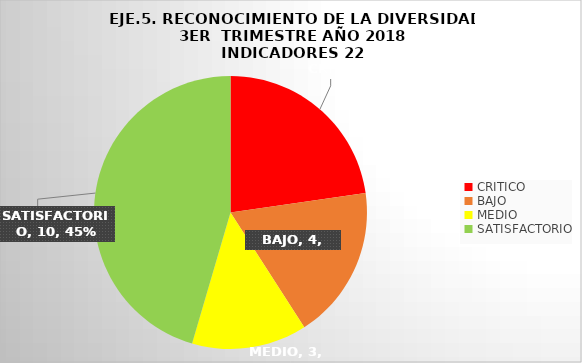
| Category | Series 0 |
|---|---|
| CRITICO | 5 |
| BAJO | 4 |
| MEDIO | 3 |
| SATISFACTORIO | 10 |